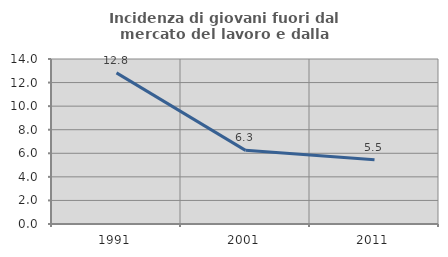
| Category | Incidenza di giovani fuori dal mercato del lavoro e dalla formazione  |
|---|---|
| 1991.0 | 12.821 |
| 2001.0 | 6.25 |
| 2011.0 | 5.455 |